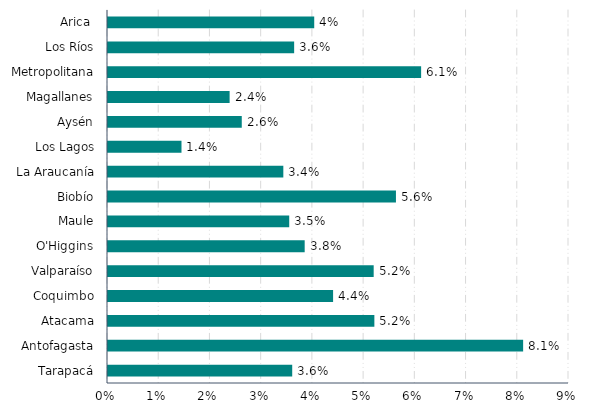
| Category | Series 0 |
|---|---|
| Tarapacá | 0.036 |
| Antofagasta | 0.081 |
| Atacama | 0.052 |
| Coquimbo | 0.044 |
| Valparaíso | 0.052 |
| O'Higgins | 0.038 |
| Maule | 0.035 |
| Biobío | 0.056 |
| La Araucanía | 0.034 |
| Los Lagos | 0.014 |
| Aysén | 0.026 |
| Magallanes | 0.024 |
| Metropolitana | 0.061 |
| Los Ríos | 0.036 |
| Arica  | 0.04 |